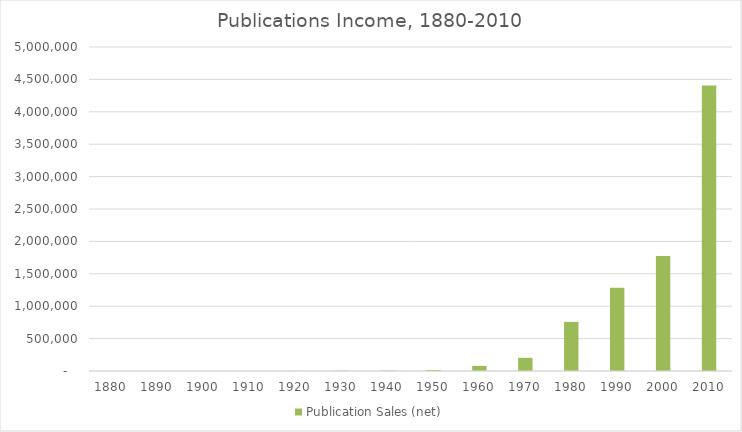
| Category | Publication Sales (net) |
|---|---|
| 1880.0 | 789.575 |
| 1890.0 | 659.175 |
| 1900.0 | 708.3 |
| 1910.0 | 987.4 |
| 1920.0 | 1351.1 |
| 1930.0 | 5002.812 |
| 1940.0 | 5936.554 |
| 1950.0 | 16414.054 |
| 1960.0 | 79019 |
| 1970.0 | 203362 |
| 1980.0 | 758122 |
| 1990.0 | 1284060 |
| 2000.0 | 1773000 |
| 2010.0 | 4406000 |